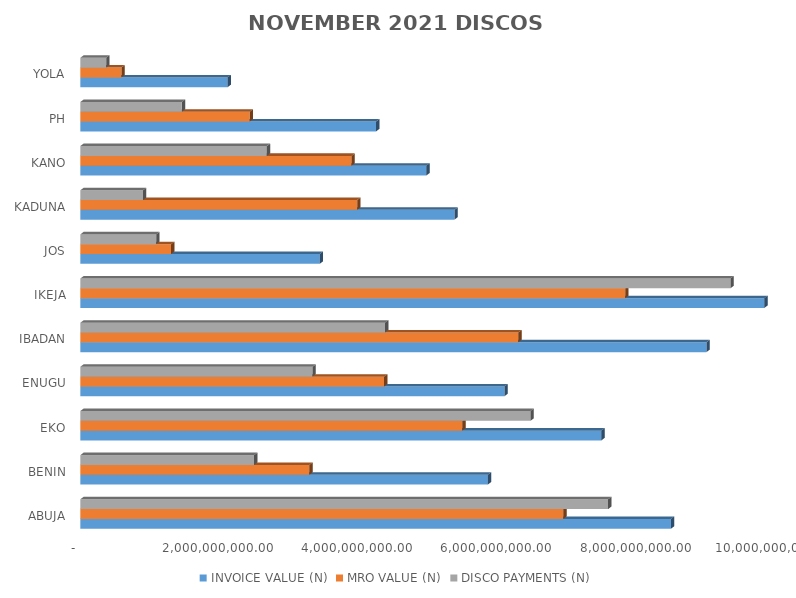
| Category | INVOICE VALUE (N) | MRO VALUE (N) | DISCO PAYMENTS (N) |
|---|---|---|---|
| ABUJA | 8487653057.7 | 6940353905.281 | 7583718007.05 |
| BENIN | 5855863092.61 | 3290409471.738 | 2496780221.55 |
| EKO | 7486538371.59 | 5489878587.887 | 6469117806.89 |
| ENUGU | 6094210964.74 | 4365283314.043 | 3335386752.15 |
| IBADAN | 8997130764.58 | 6294392682.9 | 4378535940.76 |
| IKEJA | 9828683089.88 | 7829528949.398 | 9341180408.62 |
| JOS | 3440712653.23 | 1303341953.044 | 1089356227.53 |
| KADUNA | 5375463348.28 | 3977842877.727 | 900524590.13 |
| KANO | 4971674053.16 | 3896798122.867 | 2680480946.22 |
| PH | 4250051625.03 | 2434004565.655 | 1459392763.9 |
| YOLA | 2115241523.67 | 590786957.561 | 370993065.49 |